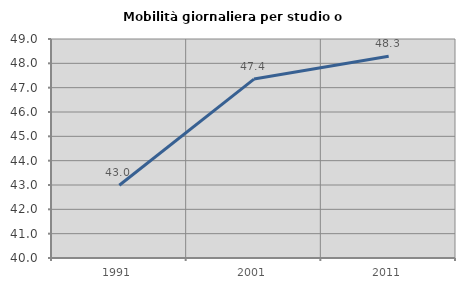
| Category | Mobilità giornaliera per studio o lavoro |
|---|---|
| 1991.0 | 42.991 |
| 2001.0 | 47.354 |
| 2011.0 | 48.293 |